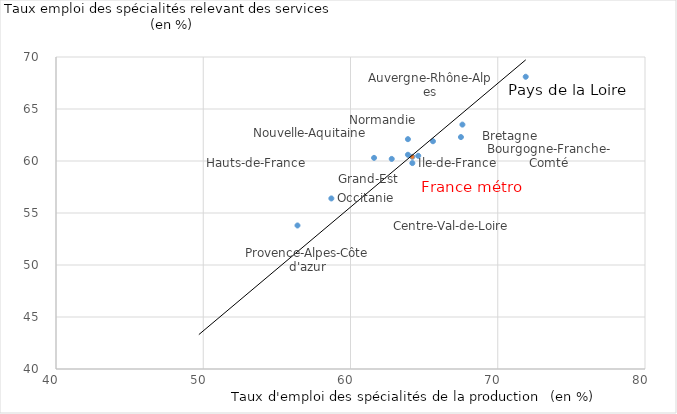
| Category | Taux emploi des spécialité de production |
|---|---|
| 67.6 | 63.5 |
| 63.9 | 62.1 |
| 67.5 | 62.3 |
| 64.6 | 60.5 |
| 49.7 | 38.7 |
| 62.8 | 60.2 |
| 61.6 | 60.3 |
| 64.2 | 59.8 |
| 65.6 | 61.9 |
| 63.9 | 60.6 |
| 58.7 | 56.4 |
| 71.9 | 68.1 |
| 56.4 | 53.8 |
| 64.2 | 60.4 |